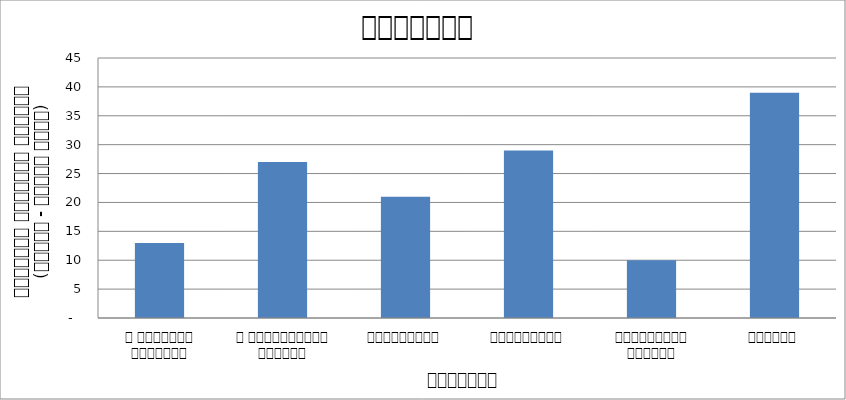
| Category | सुरक्षा |
|---|---|
| द हिमालयन टाइम्स् | 13 |
| द काठमाण्डौं पोस्ट् | 27 |
| रिपब्लिका | 21 |
| कान्तिपुर | 29 |
| अन्नपूर्ण पोस्ट् | 10 |
| नागरिक | 39 |